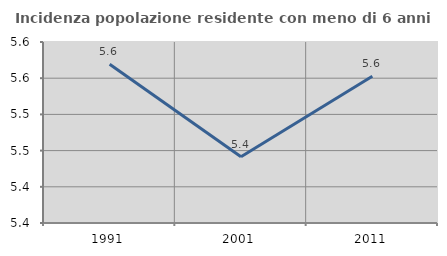
| Category | Incidenza popolazione residente con meno di 6 anni |
|---|---|
| 1991.0 | 5.569 |
| 2001.0 | 5.441 |
| 2011.0 | 5.553 |